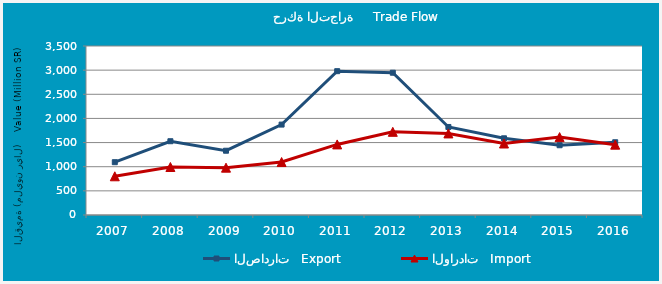
| Category | الصادرات   Export | الواردات   Import |
|---|---|---|
| 2007.0 | 1093.739 | 801.793 |
| 2008.0 | 1527.858 | 993.936 |
| 2009.0 | 1331.024 | 980.252 |
| 2010.0 | 1872.545 | 1096.964 |
| 2011.0 | 2978.608 | 1461.837 |
| 2012.0 | 2946.563 | 1722.646 |
| 2013.0 | 1823.065 | 1689.339 |
| 2014.0 | 1588.338 | 1480.565 |
| 2015.0 | 1444.634 | 1613.28 |
| 2016.0 | 1506.43 | 1456.752 |